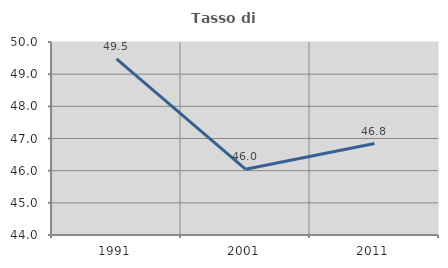
| Category | Tasso di occupazione   |
|---|---|
| 1991.0 | 49.474 |
| 2001.0 | 46.045 |
| 2011.0 | 46.842 |